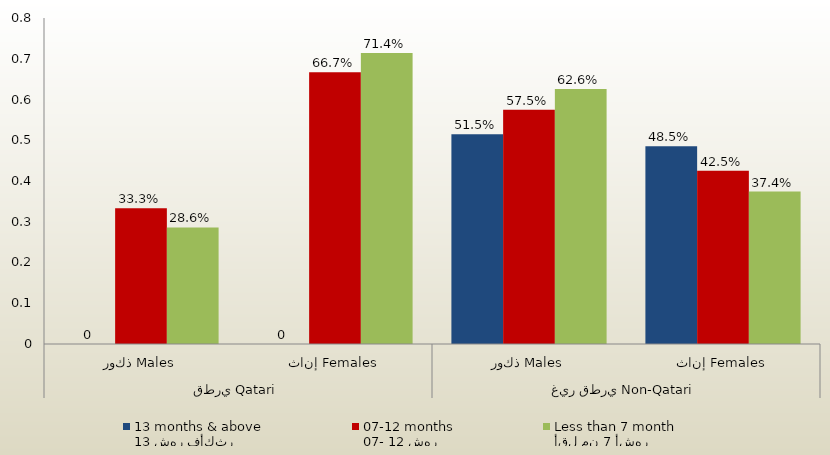
| Category | 13 شهر فأكثر
13 months & above | 07- 12 شهر
07-12 months | أقل من 7 أشهر
Less than 7 month  |
|---|---|---|---|
| 0 | 0 | 0.333 | 0.286 |
| 1 | 0 | 0.667 | 0.714 |
| 2 | 0.515 | 0.575 | 0.626 |
| 3 | 0.485 | 0.425 | 0.374 |